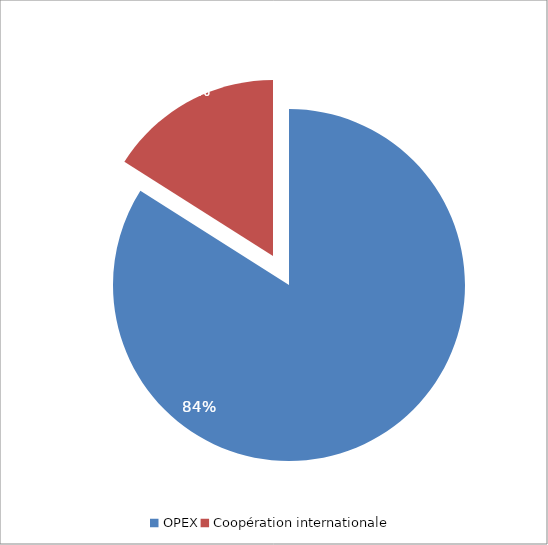
| Category | Series 1 | Series 0 |
|---|---|---|
| 0 | 1108.5 |  |
| 1 | 211.2 |  |